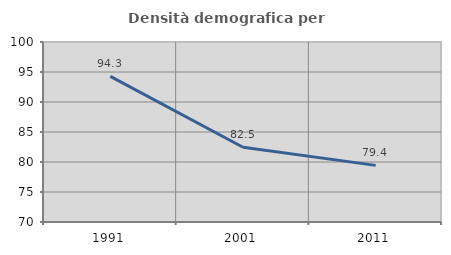
| Category | Densità demografica |
|---|---|
| 1991.0 | 94.27 |
| 2001.0 | 82.461 |
| 2011.0 | 79.438 |